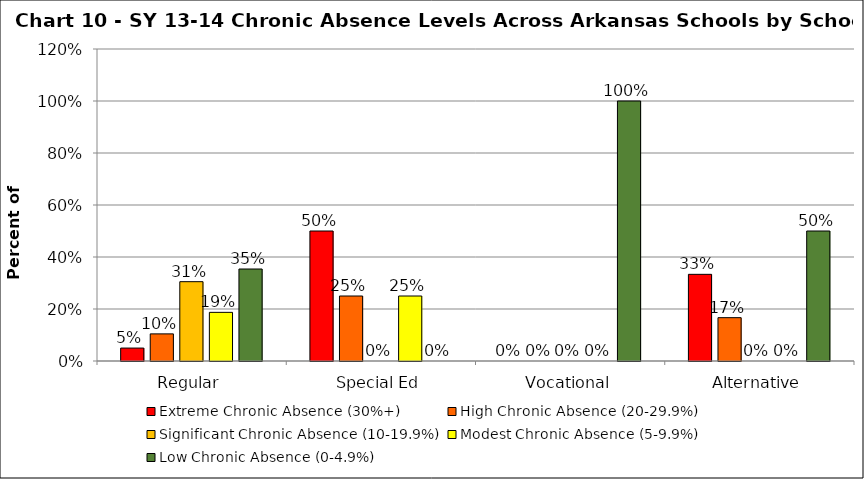
| Category | Extreme Chronic Absence (30%+) | High Chronic Absence (20-29.9%) | Significant Chronic Absence (10-19.9%) | Modest Chronic Absence (5-9.9%) | Low Chronic Absence (0-4.9%) |
|---|---|---|---|---|---|
| 0 | 0.05 | 0.104 | 0.305 | 0.187 | 0.354 |
| 1 | 0.5 | 0.25 | 0 | 0.25 | 0 |
| 2 | 0 | 0 | 0 | 0 | 1 |
| 3 | 0.333 | 0.167 | 0 | 0 | 0.5 |